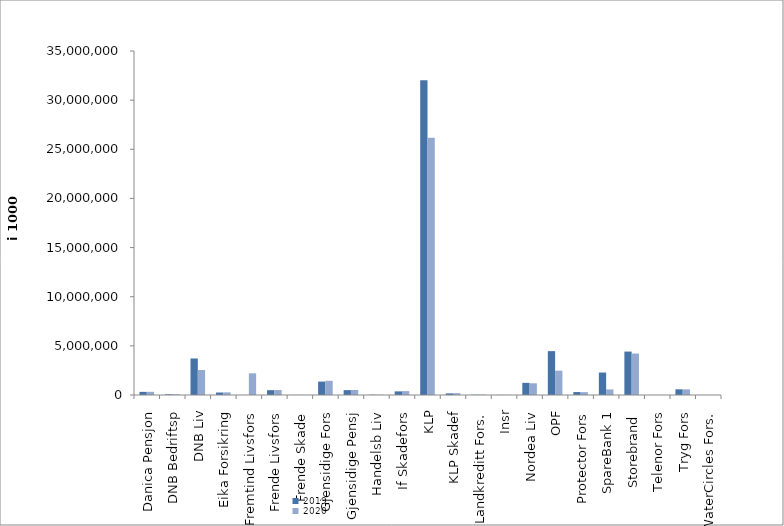
| Category | 2019 | 2020 |
|---|---|---|
| Danica Pensjon | 317604.171 | 322886.593 |
| DNB Bedriftsp | 74207 | 74436 |
| DNB Liv | 3715260.492 | 2544846.847 |
| Eika Forsikring | 252371 | 269700 |
| Fremtind Livsfors | 0 | 2205150 |
| Frende Livsfors | 491735 | 504078 |
| Frende Skade | 6362.257 | 3713.263 |
| Gjensidige Fors | 1365659 | 1445145 |
| Gjensidige Pensj | 495734 | 508839 |
| Handelsb Liv | 26625.803 | 26171.042 |
| If Skadefors | 368992.594 | 396241.547 |
| KLP | 32032545.142 | 26170501.343 |
| KLP Skadef | 163742.539 | 185388.552 |
| Landkreditt Fors. | 28648 | 38656 |
| Insr | 12781.715 | 11145.354 |
| Nordea Liv | 1234767.866 | 1190396.896 |
| OPF | 4463574 | 2473460 |
| Protector Fors | 298592.884 | 287049.49 |
| SpareBank 1 | 2285218.036 | 566972.152 |
| Storebrand  | 4417928.83 | 4218437.496 |
| Telenor Fors | 0 | 0 |
| Tryg Fors | 577343.847 | 574050.939 |
| WaterCircles Fors. | 0 | 1151 |